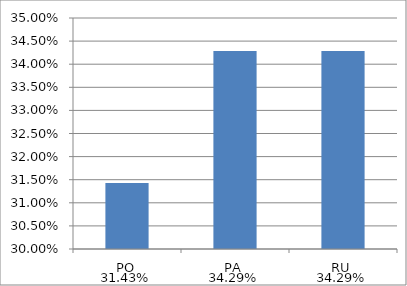
| Category | Series 0 |
|---|---|
| PO | 0.314 |
| PA | 0.343 |
| RU | 0.343 |